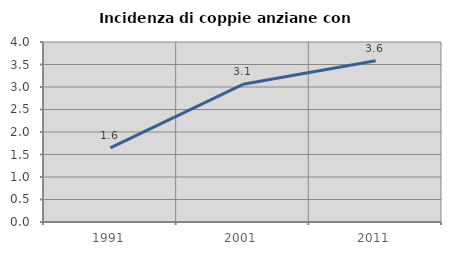
| Category | Incidenza di coppie anziane con figli |
|---|---|
| 1991.0 | 1.649 |
| 2001.0 | 3.06 |
| 2011.0 | 3.584 |